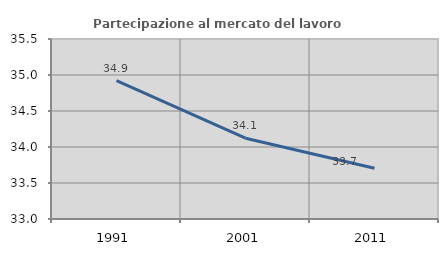
| Category | Partecipazione al mercato del lavoro  femminile |
|---|---|
| 1991.0 | 34.921 |
| 2001.0 | 34.122 |
| 2011.0 | 33.704 |